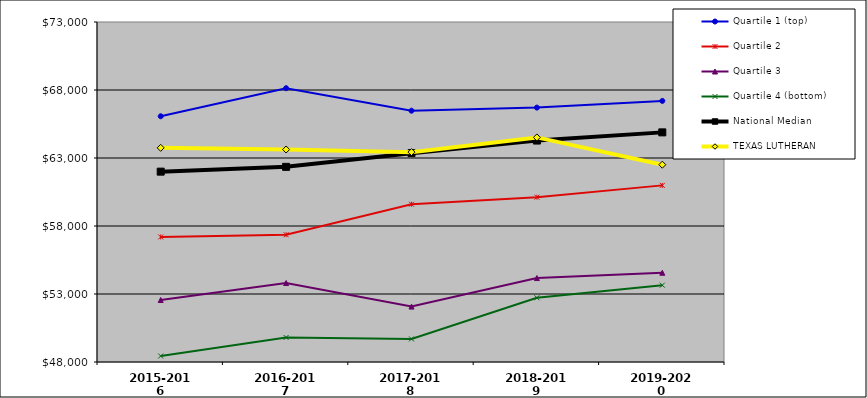
| Category | Quartile 1 (top) | Quartile 2 | Quartile 3 | Quartile 4 (bottom) | National Median | TEXAS LUTHERAN |
|---|---|---|---|---|---|---|
| 2015-2016 | 66069 | 57195 | 52560 | 48438 | 61996.5 | 63747 |
| 2016-2017 | 68131 | 57361 | 53807 | 49803 | 62349 | 63624 |
| 2017-2018 | 66478 | 59601 | 52075 | 49696 | 63357 | 63432 |
| 2018-2019 | 66706 | 60119 | 54172 | 52723.5 | 64282.5 | 64514 |
| 2019-2020 | 67199 | 60987 | 54563 | 53649.5 | 64884.5 | 62508 |